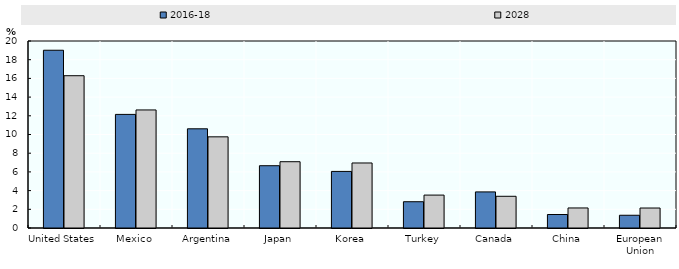
| Category | 2016-18 | 2028 |
|---|---|---|
| United States | 19.011 | 16.287 |
| Mexico | 12.15 | 12.627 |
| Argentina | 10.61 | 9.75 |
| Japan | 6.662 | 7.09 |
| Korea | 6.051 | 6.955 |
| Turkey | 2.81 | 3.52 |
| Canada | 3.859 | 3.391 |
| China | 1.443 | 2.143 |
| European Union | 1.363 | 2.137 |